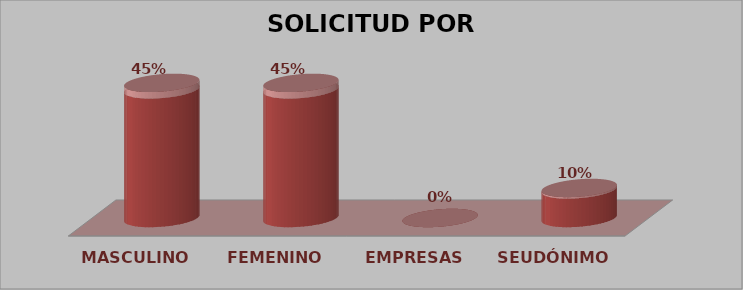
| Category | SOLICITUD POR SEXO | Series 1 |
|---|---|---|
| MASCULINO | 9 | 0.45 |
| FEMENINO | 9 | 0.45 |
| EMPRESAS | 0 | 0 |
| SEUDÓNIMO | 2 | 0.1 |